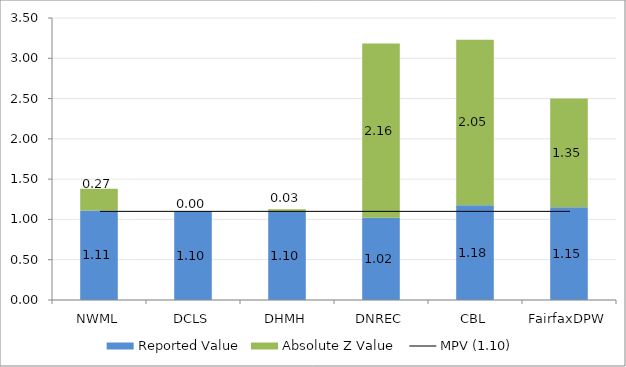
| Category | Reported Value | Absolute Z Value  |
|---|---|---|
| NWML | 1.11 | 0.27 |
| DCLS | 1.1 | 0 |
| DHMH | 1.099 | 0.027 |
| DNREC | 1.02 | 2.162 |
| CBL | 1.176 | 2.054 |
| FairfaxDPW | 1.15 | 1.351 |